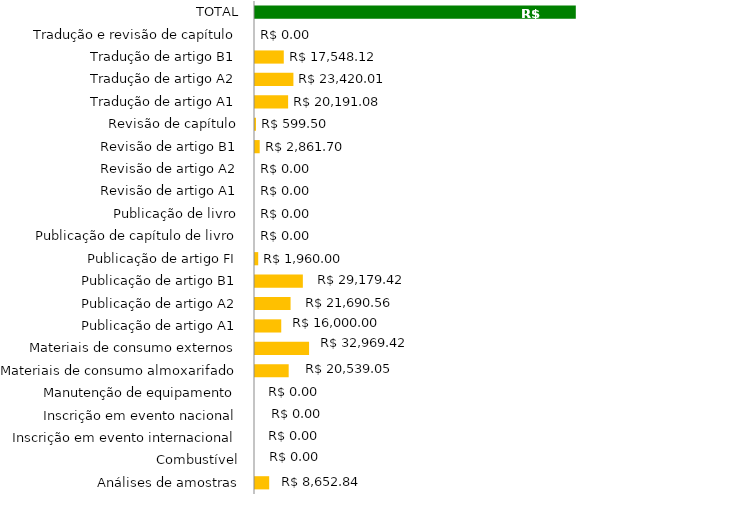
| Category | Series 1 |
|---|---|
| Análises de amostras | 8652.84 |
| Combustível | 0 |
| Inscrição em evento internacional | 0 |
| Inscrição em evento nacional | 0 |
| Manutenção de equipamento | 0 |
| Materiais de consumo almoxarifado | 20539.05 |
| Materiais de consumo externos | 32969.42 |
| Publicação de artigo A1 | 16000 |
| Publicação de artigo A2 | 21690.56 |
| Publicação de artigo B1 | 29179.42 |
| Publicação de artigo FI | 1960 |
| Publicação de capítulo de livro | 0 |
| Publicação de livro | 0 |
| Revisão de artigo A1 | 0 |
| Revisão de artigo A2 | 0 |
| Revisão de artigo B1 | 2861.7 |
| Revisão de capítulo | 599.5 |
| Tradução de artigo A1 | 20191.08 |
| Tradução de artigo A2 | 23420.01 |
| Tradução de artigo B1 | 17548.12 |
| Tradução e revisão de capítulo | 0 |
| TOTAL | 195611.7 |